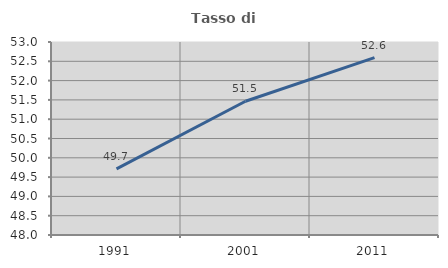
| Category | Tasso di occupazione   |
|---|---|
| 1991.0 | 49.715 |
| 2001.0 | 51.466 |
| 2011.0 | 52.596 |